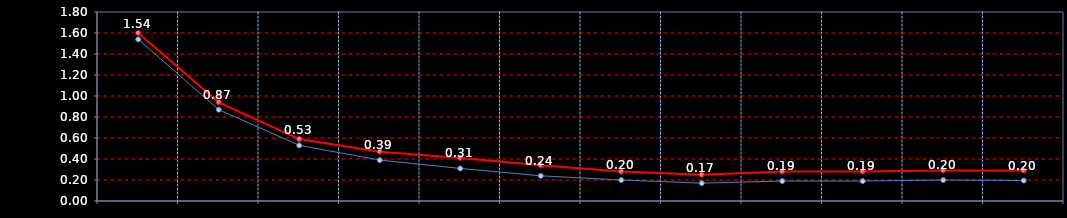
| Category | Last | Settlement |
|---|---|---|
|  | 1.54 | 1.6 |
|  | 0.87 | 0.94 |
|  | 0.53 | 0.59 |
|  | 0.39 | 0.47 |
|  | 0.31 | 0.41 |
|  | 0.24 | 0.34 |
|  | 0.2 | 0.28 |
|  | 0.17 | 0.25 |
|  | 0.19 | 0.28 |
|  | 0.19 | 0.28 |